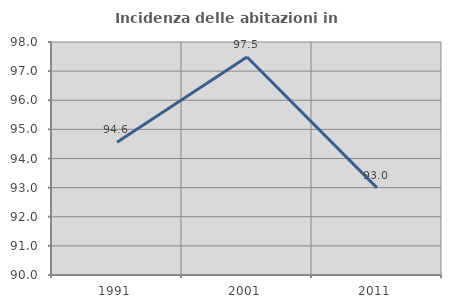
| Category | Incidenza delle abitazioni in proprietà  |
|---|---|
| 1991.0 | 94.558 |
| 2001.0 | 97.483 |
| 2011.0 | 92.991 |